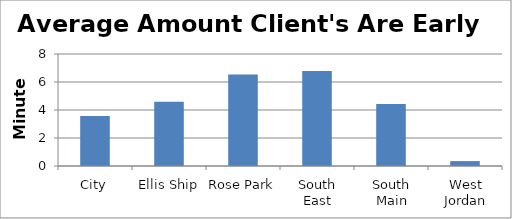
| Category | Average Minutes Client's Are Early |
|---|---|
| City | 3.58 |
| Ellis Ship | 4.59 |
| Rose Park | 6.53 |
| South East | 6.79 |
| South Main | 4.43 |
| West Jordan | 0.35 |